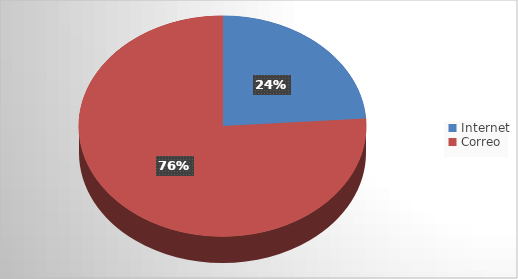
| Category | Series 0 |
|---|---|
| Internet | 16 |
| Correo | 51 |